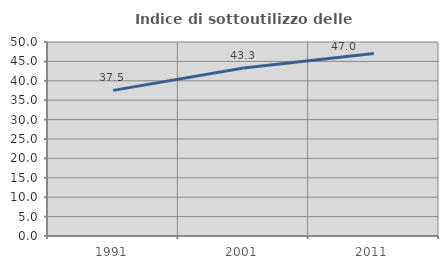
| Category | Indice di sottoutilizzo delle abitazioni  |
|---|---|
| 1991.0 | 37.529 |
| 2001.0 | 43.31 |
| 2011.0 | 47.012 |